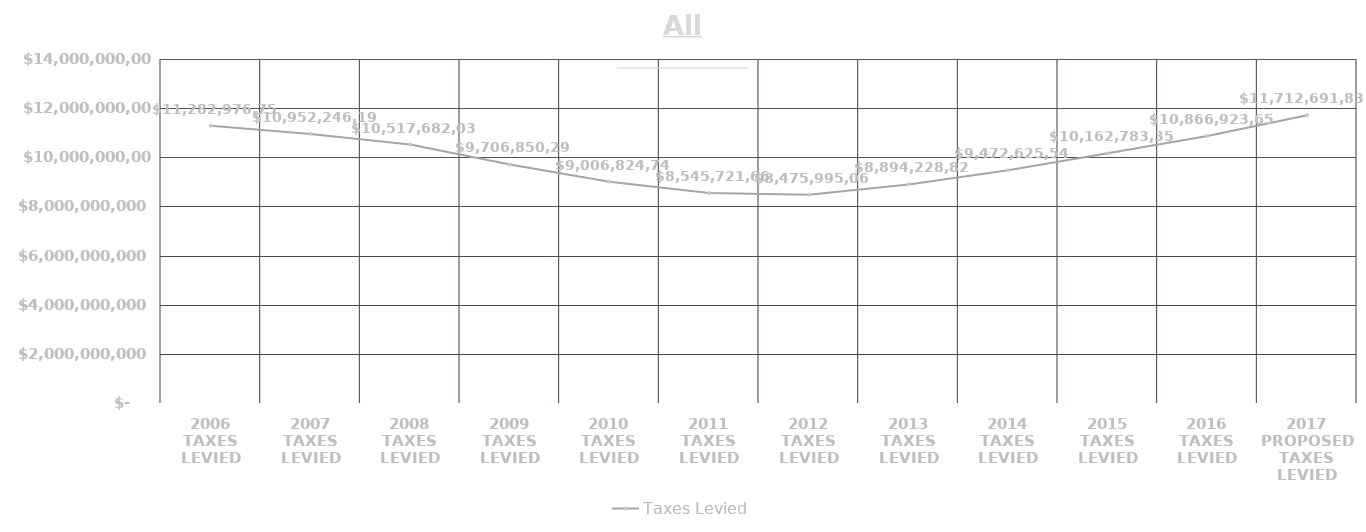
| Category | Taxes Levied |
|---|---|
| 2006 TAXES LEVIED | 11282976754 |
| 2007 TAXES LEVIED | 10952246193 |
| 2008 TAXES LEVIED | 10517682032 |
| 2009 TAXES LEVIED | 9706850297 |
| 2010 TAXES LEVIED | 9006824742 |
| 2011 TAXES LEVIED | 8545721664 |
| 2012 TAXES LEVIED | 8475995061 |
| 2013 TAXES LEVIED | 8894228825 |
| 2014 TAXES LEVIED | 9472625549 |
| 2015 TAXES LEVIED | 10162783356 |
| 2016 TAXES LEVIED | 10866923654 |
| 2017 PROPOSED TAXES LEVIED | 11712691831 |